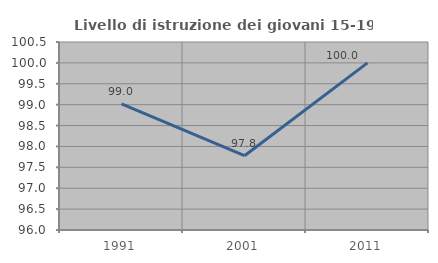
| Category | Livello di istruzione dei giovani 15-19 anni |
|---|---|
| 1991.0 | 99.02 |
| 2001.0 | 97.778 |
| 2011.0 | 100 |